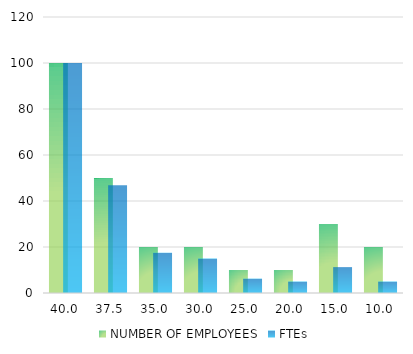
| Category | NUMBER OF EMPLOYEES | FTEs |
|---|---|---|
| 40.0 | 100 | 100 |
| 37.5 | 50 | 46.875 |
| 35.0 | 20 | 17.5 |
| 30.0 | 20 | 15 |
| 25.0 | 10 | 6.25 |
| 20.0 | 10 | 5 |
| 15.0 | 30 | 11.25 |
| 10.0 | 20 | 5 |